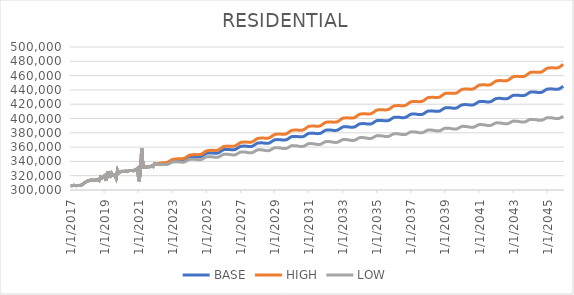
| Category | BASE | HIGH | LOW |
|---|---|---|---|
| 1/1/17 | 305934 | 305934 | 305934 |
| 2/1/17 | 306065 | 306065 | 306065 |
| 3/1/17 | 306638 | 306638 | 306638 |
| 4/1/17 | 306334 | 306334 | 306334 |
| 5/1/17 | 306006 | 306006 | 306006 |
| 6/1/17 | 306374 | 306374 | 306374 |
| 7/1/17 | 306211 | 306211 | 306211 |
| 8/1/17 | 306668 | 306668 | 306668 |
| 9/1/17 | 307239 | 307239 | 307239 |
| 10/1/17 | 308937 | 308937 | 308937 |
| 11/1/17 | 310546 | 310546 | 310546 |
| 12/1/17 | 311518 | 311518 | 311518 |
| 1/1/18 | 312888 | 312888 | 312888 |
| 2/1/18 | 312860 | 312860 | 312860 |
| 3/1/18 | 313994 | 313994 | 313994 |
| 4/1/18 | 313697 | 313697 | 313697 |
| 5/1/18 | 313973 | 313973 | 313973 |
| 6/1/18 | 313676 | 313676 | 313676 |
| 7/1/18 | 314050 | 314050 | 314050 |
| 8/1/18 | 314505 | 314505 | 314505 |
| 9/1/18 | 313214 | 313214 | 313214 |
| 10/1/18 | 318178 | 318178 | 318178 |
| 11/1/18 | 316721 | 316721 | 316721 |
| 12/1/18 | 318847 | 318847 | 318847 |
| 1/1/19 | 320173 | 320173 | 320173 |
| 2/1/19 | 312778 | 312778 | 312778 |
| 3/1/19 | 325508 | 325508 | 325508 |
| 4/1/19 | 316876 | 316876 | 316876 |
| 5/1/19 | 326358 | 326358 | 326358 |
| 6/1/19 | 320174 | 320174 | 320174 |
| 7/1/19 | 320905 | 320905 | 320905 |
| 8/1/19 | 321470 | 321470 | 321470 |
| 9/1/19 | 316528 | 316528 | 316528 |
| 10/1/19 | 327734 | 327734 | 327734 |
| 11/1/19 | 323913 | 323913 | 323913 |
| 12/1/19 | 325102 | 325102 | 325102 |
| 1/1/20 | 326124 | 326124 | 326124 |
| 2/1/20 | 325892 | 325892 | 325892 |
| 3/1/20 | 326361 | 326361 | 326361 |
| 4/1/20 | 326527 | 326527 | 326527 |
| 5/1/20 | 325798 | 325798 | 325798 |
| 6/1/20 | 327186 | 327186 | 327186 |
| 7/1/20 | 327131 | 327131 | 327131 |
| 8/1/20 | 327289 | 327289 | 327289 |
| 9/1/20 | 326799 | 326799 | 326799 |
| 10/1/20 | 327886 | 327886 | 327886 |
| 11/1/20 | 328385 | 328385 | 328385 |
| 12/1/20 | 330124 | 330124 | 330124 |
| 1/1/21 | 312364.667 | 312364.667 | 312364.667 |
| 2/1/21 | 322836.667 | 322836.667 | 322836.667 |
| 3/1/21 | 357961.667 | 357961.667 | 357961.667 |
| 4/1/21 | 331671 | 331671 | 331671 |
| 5/1/21 | 331516 | 331516 | 331516 |
| 6/1/21 | 332197 | 332197 | 332197 |
| 7/1/21 | 332130 | 332130 | 332130 |
| 8/1/21 | 332554 | 332554 | 332554 |
| 9/1/21 | 332525 | 332525 | 332525 |
| 10/1/21 | 333657 | 333657 | 333657 |
| 11/1/21 | 332739 | 332739 | 332739 |
| 12/1/21 | 336867 | 336867 | 336867 |
| 1/1/22 | 336228 | 336228 | 336228 |
| 2/1/22 | 336250 | 336250 | 336250 |
| 3/1/22 | 336539.375 | 337210.081 | 335529.096 |
| 4/1/22 | 336837.914 | 337584.02 | 335714.46 |
| 5/1/22 | 336954.041 | 337775.159 | 335717.95 |
| 6/1/22 | 337096.092 | 337992.685 | 335746.973 |
| 7/1/22 | 337095.563 | 338067.226 | 335633.946 |
| 8/1/22 | 337200.808 | 338247.96 | 335626.154 |
| 9/1/22 | 337354.381 | 338477.483 | 335666.326 |
| 10/1/22 | 338385.686 | 339587.763 | 336579.703 |
| 11/1/22 | 339517.722 | 340799.279 | 337592.951 |
| 12/1/22 | 340677.242 | 342039.107 | 338632.651 |
| 1/1/23 | 341467.324 | 342908.591 | 339304.317 |
| 2/1/23 | 341548.319 | 343066.102 | 339271.254 |
| 3/1/23 | 341810.29 | 343405.423 | 339417.949 |
| 4/1/23 | 341926.069 | 343597.932 | 339419.419 |
| 5/1/23 | 341930.148 | 343678.306 | 339309.805 |
| 6/1/23 | 341758.478 | 343582.503 | 339025.434 |
| 7/1/23 | 341782.887 | 343683.889 | 338935.541 |
| 8/1/23 | 341846.08 | 343824.289 | 338884.057 |
| 9/1/23 | 342154.589 | 344211.85 | 339075.571 |
| 10/1/23 | 343199.703 | 345339.942 | 339997.621 |
| 11/1/23 | 344500.313 | 346725.386 | 341172.321 |
| 12/1/23 | 345739.458 | 348049.89 | 342285.187 |
| 1/1/24 | 346548.95 | 348942.277 | 342971.885 |
| 2/1/24 | 346640.284 | 349111.785 | 342947.54 |
| 3/1/24 | 346868.609 | 349419.173 | 343058.943 |
| 4/1/24 | 346939.007 | 349567.762 | 343013.772 |
| 5/1/24 | 346876.266 | 349582.301 | 342836.757 |
| 6/1/24 | 346620.711 | 349403.172 | 342468.646 |
| 7/1/24 | 346623.945 | 349484.93 | 342356.281 |
| 8/1/24 | 346698.39 | 349638.585 | 342314 |
| 9/1/24 | 347057.679 | 350079.878 | 342552.903 |
| 10/1/24 | 348133.051 | 351242.527 | 343499.734 |
| 11/1/24 | 349479.41 | 352678.76 | 344713.552 |
| 12/1/24 | 350747.736 | 354037.322 | 345849.345 |
| 1/1/25 | 351583.123 | 354959.378 | 346557.222 |
| 2/1/25 | 351664.427 | 355120.387 | 346521.479 |
| 3/1/25 | 351861.823 | 355398.515 | 346600.468 |
| 4/1/25 | 351877.127 | 355493.151 | 346499.46 |
| 5/1/25 | 351777.504 | 355471.859 | 346284.979 |
| 6/1/25 | 351481.84 | 355253.25 | 345876.867 |
| 7/1/25 | 351475.188 | 355326.684 | 345753.306 |
| 8/1/25 | 351551.547 | 355484.13 | 345711.072 |
| 9/1/25 | 351932.881 | 355950.342 | 345968.793 |
| 10/1/25 | 353031.25 | 357140.401 | 346933.024 |
| 11/1/25 | 354404.577 | 358608.646 | 348167.194 |
| 12/1/25 | 355688.946 | 359988.133 | 349312.818 |
| 1/1/26 | 356530.281 | 360919.84 | 350022.11 |
| 2/1/26 | 356599.636 | 361070.433 | 349973.121 |
| 3/1/26 | 356773.984 | 361327.169 | 350027.612 |
| 4/1/26 | 356752.329 | 361385.963 | 349888.999 |
| 5/1/26 | 356628.685 | 361341.638 | 349649.992 |
| 6/1/26 | 356316.025 | 361106.756 | 349224.862 |
| 7/1/26 | 356285.384 | 361157.49 | 349076.43 |
| 8/1/26 | 356338.724 | 361293.357 | 349009.937 |
| 9/1/26 | 356710.079 | 361752.057 | 349255.095 |
| 10/1/26 | 357804.424 | 362942.172 | 350210.225 |
| 11/1/26 | 359168.774 | 364406.063 | 351429.474 |
| 12/1/26 | 360437.124 | 365774.003 | 352553.539 |
| 1/1/27 | 361257.47 | 366687.988 | 353238.007 |
| 2/1/27 | 361292.823 | 366805.635 | 353154.421 |
| 3/1/27 | 361429.167 | 367025.606 | 353170.081 |
| 4/1/27 | 361368.52 | 367046.181 | 352992.327 |
| 5/1/27 | 361206.866 | 366964.343 | 352715.518 |
| 6/1/27 | 360860.217 | 366695.676 | 352257.123 |
| 7/1/27 | 360826.565 | 366744.839 | 352104.564 |
| 8/1/27 | 360885.913 | 366888.48 | 352042.44 |
| 9/1/27 | 361264.264 | 367356.856 | 352291.711 |
| 10/1/27 | 362366.611 | 368559.234 | 353249.55 |
| 11/1/27 | 363737.961 | 370034.994 | 354469.597 |
| 12/1/27 | 365006.309 | 371407.638 | 355587.866 |
| 1/1/28 | 365820.659 | 372319.076 | 356262.283 |
| 2/1/28 | 365846.007 | 372428.009 | 356167.776 |
| 3/1/28 | 365971.356 | 372638.527 | 356171.23 |
| 4/1/28 | 365900.705 | 372650.192 | 355982.85 |
| 5/1/28 | 365727.053 | 372557.159 | 355693.815 |
| 6/1/28 | 365375.403 | 372284.062 | 355230.627 |
| 7/1/28 | 365342.751 | 372335.712 | 355077.94 |
| 8/1/28 | 365405.101 | 372484.09 | 355017.211 |
| 9/1/28 | 365791.449 | 372963.186 | 355271.578 |
| 10/1/28 | 366899.798 | 374175.835 | 356230.204 |
| 11/1/28 | 368273.147 | 375658.432 | 357446.133 |
| 12/1/28 | 369542.496 | 377036.822 | 358559.607 |
| 1/1/29 | 370351.845 | 377946.713 | 359225.026 |
| 2/1/29 | 370373.193 | 378053.028 | 359125.492 |
| 3/1/29 | 370491.542 | 378258.075 | 359120.723 |
| 4/1/29 | 370414.891 | 378264.853 | 358925.728 |
| 5/1/29 | 370239.24 | 378170.743 | 358634.303 |
| 6/1/29 | 369885.589 | 377896.241 | 358169.291 |
| 7/1/29 | 369851.938 | 377948.306 | 358014.557 |
| 8/1/29 | 369918.287 | 378102.452 | 357956.232 |
| 9/1/29 | 370304.635 | 378584.165 | 358207.889 |
| 10/1/29 | 371412.984 | 379800.968 | 359161.509 |
| 11/1/29 | 372786.333 | 381288.406 | 360371.398 |
| 12/1/29 | 374051.682 | 382667.439 | 361475.276 |
| 1/1/30 | 374857.031 | 383576.761 | 362132.759 |
| 2/1/30 | 374872.38 | 383678.366 | 362026.351 |
| 3/1/30 | 374983.729 | 383877.889 | 362013.467 |
| 4/1/30 | 374903.077 | 383881.75 | 361813.893 |
| 5/1/30 | 374723.426 | 383784.464 | 361518.233 |
| 6/1/30 | 374369.775 | 383510.601 | 361053.324 |
| 7/1/30 | 374339.124 | 383567.239 | 360900.388 |
| 8/1/30 | 374406.473 | 383724.146 | 360841.487 |
| 9/1/30 | 374793.822 | 384209.578 | 361091.398 |
| 10/1/30 | 375905.171 | 385433.721 | 362042.791 |
| 11/1/30 | 377278.519 | 386926.066 | 363246.653 |
| 12/1/30 | 378542.868 | 388308.851 | 364343.844 |
| 1/1/31 | 379347.217 | 389220.76 | 364996.218 |
| 2/1/31 | 379360.566 | 389321.797 | 364886.774 |
| 3/1/31 | 379471.915 | 389522.981 | 364872.583 |
| 4/1/31 | 379390.264 | 389527.045 | 364671.285 |
| 5/1/31 | 379211.613 | 389431.776 | 364376.143 |
| 6/1/31 | 378858.961 | 389159.608 | 363912.318 |
| 7/1/31 | 378829.31 | 389218.78 | 363759.249 |
| 8/1/31 | 378898.659 | 389379.516 | 363700.732 |
| 9/1/31 | 379288.008 | 389869.722 | 363949.801 |
| 10/1/31 | 380398.357 | 391097.166 | 364895.131 |
| 11/1/31 | 381770.706 | 392593.382 | 366092.051 |
| 12/1/31 | 383034.055 | 393979.956 | 367182.59 |
| 1/1/32 | 383837.403 | 394894.439 | 367829.938 |
| 2/1/32 | 383848.752 | 394994.871 | 367717.528 |
| 3/1/32 | 383960.101 | 395197.751 | 367701.964 |
| 4/1/32 | 383877.45 | 395202.04 | 367498.958 |
| 5/1/32 | 383700.799 | 395109.789 | 367205.349 |
| 6/1/32 | 383350.148 | 394840.371 | 366743.54 |
| 7/1/32 | 383319.497 | 394900.073 | 366588.369 |
| 8/1/32 | 383386.845 | 395060.552 | 366526.429 |
| 9/1/32 | 383776.194 | 395553.488 | 366772.806 |
| 10/1/32 | 384884.543 | 396783.174 | 367711.185 |
| 11/1/32 | 386254.892 | 398282.284 | 368900.188 |
| 12/1/32 | 387517.241 | 399672.683 | 369984.115 |
| 1/1/33 | 388318.59 | 400588.666 | 370625.572 |
| 2/1/33 | 388329.939 | 400690.577 | 370512.118 |
| 3/1/33 | 388438.287 | 400892.038 | 370492.375 |
| 4/1/33 | 388355.636 | 400897.547 | 370288.676 |
| 5/1/33 | 388178.985 | 400806.299 | 369994.627 |
| 6/1/33 | 387825.334 | 400534.48 | 369530.043 |
| 7/1/33 | 387797.683 | 400598.856 | 369376.638 |
| 8/1/33 | 387864.032 | 400760.134 | 369312.207 |
| 9/1/33 | 388251.381 | 401253.816 | 369553.89 |
| 10/1/33 | 389360.73 | 402488.918 | 370488.164 |
| 11/1/33 | 390731.078 | 403993.006 | 371671.238 |
| 12/1/33 | 391991.427 | 405386.174 | 372747.661 |
| 1/1/34 | 392790.776 | 406303.761 | 373383.161 |
| 2/1/34 | 392804.125 | 406409.233 | 373270.565 |
| 3/1/34 | 392911.474 | 406611.341 | 373248.584 |
| 4/1/34 | 392827.823 | 406617.107 | 373043.166 |
| 5/1/34 | 392651.172 | 406526.887 | 372748.691 |
| 6/1/34 | 392297.52 | 406255.839 | 372284.198 |
| 7/1/34 | 392266.869 | 406318.687 | 372126.842 |
| 8/1/34 | 392333.218 | 406481.794 | 372060.862 |
| 9/1/34 | 392718.567 | 406976.185 | 372298.001 |
| 10/1/34 | 393824.916 | 408212.535 | 373224.438 |
| 11/1/34 | 395191.265 | 409717.468 | 374397.804 |
| 12/1/34 | 396452.614 | 411116.549 | 375469.546 |
| 1/1/35 | 397250.962 | 412036.73 | 376100.146 |
| 2/1/35 | 397258.311 | 412137.465 | 375980.866 |
| 3/1/35 | 397366.66 | 412342.316 | 375958.503 |
| 4/1/35 | 397283.009 | 412349.322 | 375752.41 |
| 5/1/35 | 397102.358 | 412255.977 | 375453.78 |
| 6/1/35 | 396747.707 | 411984.62 | 374988.419 |
| 7/1/35 | 396718.056 | 412050.115 | 374830.901 |
| 8/1/35 | 396783.404 | 412214.036 | 374762.512 |
| 9/1/35 | 397168.753 | 412711.235 | 374996.922 |
| 10/1/35 | 398273.102 | 413949.878 | 375916.517 |
| 11/1/35 | 399641.451 | 415461.881 | 377085.927 |
| 12/1/35 | 400899.8 | 416862.726 | 378149.34 |
| 1/1/36 | 401698.149 | 417786.545 | 378776.01 |
| 2/1/36 | 401706.498 | 417889.776 | 378656.672 |
| 3/1/36 | 401812.846 | 418094.288 | 378631.162 |
| 4/1/36 | 401730.195 | 418103.613 | 378425.319 |
| 5/1/36 | 401548.544 | 418010.239 | 378125.381 |
| 6/1/36 | 401194.893 | 417740.698 | 377661.051 |
| 7/1/36 | 401162.242 | 417804.654 | 377499.62 |
| 8/1/36 | 401225.591 | 417968.407 | 377427.808 |
| 9/1/36 | 401610.94 | 418468.398 | 377659.616 |
| 10/1/36 | 402716.288 | 419712.499 | 378575.211 |
| 11/1/36 | 404080.637 | 421225.328 | 379735.027 |
| 12/1/36 | 405339.986 | 422632.169 | 380793.824 |
| 1/1/37 | 406135.335 | 423556.533 | 381413.759 |
| 2/1/37 | 406144.684 | 423662.32 | 381294.395 |
| 3/1/37 | 406250.033 | 423867.476 | 381266.696 |
| 4/1/37 | 406166.382 | 423877.059 | 381059.246 |
| 5/1/37 | 405983.73 | 423783.742 | 380757.905 |
| 6/1/37 | 405628.079 | 423512.852 | 380291.831 |
| 7/1/37 | 405594.428 | 423577.392 | 380128.472 |
| 8/1/37 | 405658.777 | 423744.032 | 380056.111 |
| 9/1/37 | 406041.126 | 424243.714 | 380282.51 |
| 10/1/37 | 407143.475 | 425489.092 | 381190.393 |
| 11/1/37 | 408506.824 | 427005.941 | 382343.492 |
| 12/1/37 | 409765.172 | 428416.639 | 383395.848 |
| 1/1/38 | 410560.521 | 429344.647 | 384011.998 |
| 2/1/38 | 410566.87 | 429448.838 | 383888.826 |
| 3/1/38 | 410672.219 | 429655.704 | 383859.858 |
| 4/1/38 | 410586.568 | 429664.471 | 383649.941 |
| 5/1/38 | 410403.917 | 429572.22 | 383348.257 |
| 6/1/38 | 410047.266 | 429301.042 | 382881.382 |
| 7/1/38 | 410011.614 | 429365.162 | 382714.988 |
| 8/1/38 | 410072.963 | 429530.546 | 382638.419 |
| 9/1/38 | 410457.312 | 430035.206 | 382863.993 |
| 10/1/38 | 411559.661 | 431285.024 | 383767.044 |
| 11/1/38 | 412924.01 | 432807.972 | 384915.329 |
| 12/1/38 | 414181.359 | 434222.612 | 385961.328 |
| 1/1/39 | 414976.708 | 435154.353 | 386573.541 |
| 2/1/39 | 414981.056 | 435257.937 | 386447.551 |
| 3/1/39 | 415087.405 | 435467.681 | 386418.29 |
| 4/1/39 | 414998.754 | 435474.608 | 386204.896 |
| 5/1/39 | 414818.103 | 435385.524 | 385904.655 |
| 6/1/39 | 414460.452 | 435114.13 | 385436.94 |
| 7/1/39 | 414424.801 | 435179.812 | 385269.67 |
| 8/1/39 | 414485.15 | 435346.048 | 385190.679 |
| 9/1/39 | 414865.499 | 435849.315 | 385410.038 |
| 10/1/39 | 415965.847 | 437101.451 | 386306.399 |
| 11/1/39 | 417327.196 | 438626.271 | 387446.219 |
| 12/1/39 | 418581.545 | 440042.628 | 388484.123 |
| 1/1/40 | 419374.894 | 440975.982 | 389090.651 |
| 2/1/40 | 419379.243 | 441081.054 | 388963.762 |
| 3/1/40 | 419481.592 | 441288.262 | 388929.643 |
| 4/1/40 | 419392.941 | 441296.475 | 388715.584 |
| 5/1/40 | 419208.289 | 441204.223 | 388411.365 |
| 6/1/40 | 418848.638 | 440931.426 | 387942.016 |
| 7/1/40 | 418811.987 | 440997.777 | 387772.702 |
| 8/1/40 | 418872.336 | 441165.876 | 387692.332 |
| 9/1/40 | 419252.685 | 441672.053 | 387909.128 |
| 10/1/40 | 420352.034 | 442927.569 | 388799.781 |
| 11/1/40 | 421715.383 | 444459.64 | 389935.734 |
| 12/1/40 | 422967.731 | 445878.905 | 390966.381 |
| 1/1/41 | 423761.08 | 446815.91 | 391569.155 |
| 2/1/41 | 423766.429 | 446923.607 | 391442.263 |
| 3/1/41 | 423868.778 | 447132.588 | 391406.936 |
| 4/1/41 | 423781.127 | 447143.25 | 391193.1 |
| 5/1/41 | 423595.476 | 447050.976 | 390887.655 |
| 6/1/41 | 423235.825 | 446778.999 | 390418.433 |
| 7/1/41 | 423198.173 | 446846.017 | 390247.076 |
| 8/1/41 | 423257.522 | 447015.025 | 390164.386 |
| 9/1/41 | 423635.871 | 447521.994 | 390376.751 |
| 10/1/41 | 424735.22 | 448782.059 | 391262.577 |
| 11/1/41 | 426097.569 | 450318.241 | 392391.911 |
| 12/1/41 | 427349.918 | 451742.595 | 393417.142 |
| 1/1/42 | 428143.267 | 452683.433 | 394016.082 |
| 2/1/42 | 428146.615 | 452790.591 | 393886.376 |
| 3/1/42 | 428248.964 | 453001.42 | 393849.798 |
| 4/1/42 | 428159.313 | 453011.351 | 393633.442 |
| 5/1/42 | 427973.662 | 452920.255 | 393327.583 |
| 6/1/42 | 427613.011 | 452648.051 | 392857.583 |
| 7/1/42 | 427576.36 | 452717.852 | 392686.164 |
| 8/1/42 | 427637.709 | 452891.031 | 392603.708 |
| 9/1/42 | 428020.057 | 453405.176 | 392817.225 |
| 10/1/42 | 429120.406 | 454670.891 | 393699.141 |
| 11/1/42 | 430482.755 | 456212.256 | 394822.767 |
| 12/1/42 | 431738.104 | 457644.838 | 395845.428 |
| 1/1/43 | 432533.453 | 458591.696 | 396442.319 |
| 2/1/43 | 432536.802 | 458700.499 | 396311.615 |
| 3/1/43 | 432642.151 | 458916.344 | 396276.561 |
| 4/1/43 | 432554.499 | 458929.804 | 396061.364 |
| 5/1/43 | 432370.848 | 458841.991 | 395756.957 |
| 6/1/43 | 432012.197 | 458572.86 | 395288.824 |
| 7/1/43 | 431974.546 | 458643.261 | 395115.52 |
| 8/1/43 | 432033.895 | 458816.213 | 395029.901 |
| 9/1/43 | 432413.244 | 459330.113 | 395238.14 |
| 10/1/43 | 433513.593 | 460600.349 | 396115.31 |
| 11/1/43 | 434874.941 | 462145.846 | 397232.438 |
| 12/1/43 | 436129.29 | 463582.35 | 398248.97 |
| 1/1/44 | 436922.639 | 464530.858 | 398840.304 |
| 2/1/44 | 436925.988 | 464641.228 | 398708.722 |
| 3/1/44 | 437028.337 | 464855.71 | 398669.724 |
| 4/1/44 | 436937.686 | 464867.321 | 398451.228 |
| 5/1/44 | 436755.035 | 464781.662 | 398147.371 |
| 6/1/44 | 436392.383 | 464509.033 | 397675.885 |
| 7/1/44 | 436363.732 | 464591.196 | 397509.299 |
| 8/1/44 | 436429.081 | 464772.993 | 397427.417 |
| 9/1/44 | 436816.43 | 465298.745 | 397639.988 |
| 10/1/44 | 437923.779 | 466581.52 | 398518.367 |
| 11/1/44 | 439291.128 | 468139 | 399635.081 |
| 12/1/44 | 440553.477 | 469589.668 | 400653.042 |
| 1/1/45 | 441351.825 | 470547.766 | 401244.821 |
| 2/1/45 | 441362.174 | 470667.693 | 401118.263 |
| 3/1/45 | 441472.523 | 470892.953 | 401084.873 |
| 4/1/45 | 441389.872 | 470914.992 | 400872.594 |
| 5/1/45 | 441211.221 | 470835.306 | 400571.572 |
| 6/1/45 | 440857.57 | 470573.602 | 400107.917 |
| 7/1/45 | 440837.919 | 470667.638 | 399948.002 |
| 8/1/45 | 440912.268 | 470861.542 | 399872.385 |
| 9/1/45 | 441306.616 | 471398.311 | 400088.334 |
| 10/1/45 | 442423.965 | 472696.864 | 400970.608 |
| 11/1/45 | 443800.314 | 474269.7 | 402089.313 |
| 12/1/45 | 445069.663 | 475733.562 | 403107.869 |